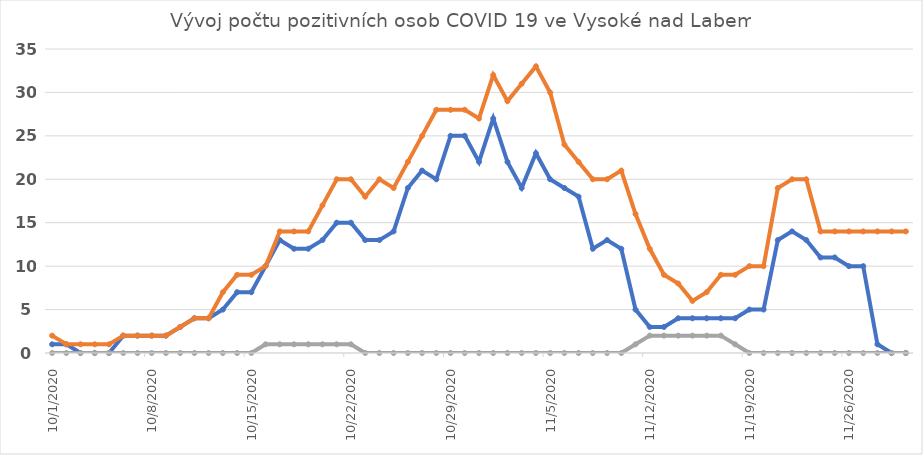
| Category | Series 0 | Series 1 | Series 2 |
|---|---|---|---|
| 10/1/20 | 1 | 2 | 0 |
| 10/2/20 | 1 | 1 | 0 |
| 10/3/20 | 0 | 1 | 0 |
| 10/4/20 | 0 | 1 | 0 |
| 10/5/20 | 0 | 1 | 0 |
| 10/6/20 | 2 | 2 | 0 |
| 10/7/20 | 2 | 2 | 0 |
| 10/8/20 | 2 | 2 | 0 |
| 10/9/20 | 2 | 2 | 0 |
| 10/10/20 | 3 | 3 | 0 |
| 10/11/20 | 4 | 4 | 0 |
| 10/12/20 | 4 | 4 | 0 |
| 10/13/20 | 5 | 7 | 0 |
| 10/14/20 | 7 | 9 | 0 |
| 10/15/20 | 7 | 9 | 0 |
| 10/16/20 | 10 | 10 | 1 |
| 10/17/20 | 13 | 14 | 1 |
| 10/18/20 | 12 | 14 | 1 |
| 10/19/20 | 12 | 14 | 1 |
| 10/20/20 | 13 | 17 | 1 |
| 10/21/20 | 15 | 20 | 1 |
| 10/22/20 | 15 | 20 | 1 |
| 10/23/20 | 13 | 18 | 0 |
| 10/24/20 | 13 | 20 | 0 |
| 10/25/20 | 14 | 19 | 0 |
| 10/26/20 | 19 | 22 | 0 |
| 10/27/20 | 21 | 25 | 0 |
| 10/28/20 | 20 | 28 | 0 |
| 10/29/20 | 25 | 28 | 0 |
| 10/30/20 | 25 | 28 | 0 |
| 10/31/20 | 22 | 27 | 0 |
| 11/1/20 | 27 | 32 | 0 |
| 11/2/20 | 22 | 29 | 0 |
| 11/3/20 | 19 | 31 | 0 |
| 11/4/20 | 23 | 33 | 0 |
| 11/5/20 | 20 | 30 | 0 |
| 11/6/20 | 19 | 24 | 0 |
| 11/7/20 | 18 | 22 | 0 |
| 11/8/20 | 12 | 20 | 0 |
| 11/9/20 | 13 | 20 | 0 |
| 11/10/20 | 12 | 21 | 0 |
| 11/11/20 | 5 | 16 | 1 |
| 11/12/20 | 3 | 12 | 2 |
| 11/13/20 | 3 | 9 | 2 |
| 11/14/20 | 4 | 8 | 2 |
| 11/15/20 | 4 | 6 | 2 |
| 11/16/20 | 4 | 7 | 2 |
| 11/17/20 | 4 | 9 | 2 |
| 11/18/20 | 4 | 9 | 1 |
| 11/19/20 | 5 | 10 | 0 |
| 11/20/20 | 5 | 10 | 0 |
| 11/21/20 | 13 | 19 | 0 |
| 11/22/20 | 14 | 20 | 0 |
| 11/23/20 | 13 | 20 | 0 |
| 11/24/20 | 11 | 14 | 0 |
| 11/25/20 | 11 | 14 | 0 |
| 11/26/20 | 10 | 14 | 0 |
| 11/27/20 | 10 | 14 | 0 |
| 11/28/20 | 1 | 14 | 0 |
| 11/29/20 | 0 | 14 | 0 |
| 11/30/20 | 0 | 14 | 0 |